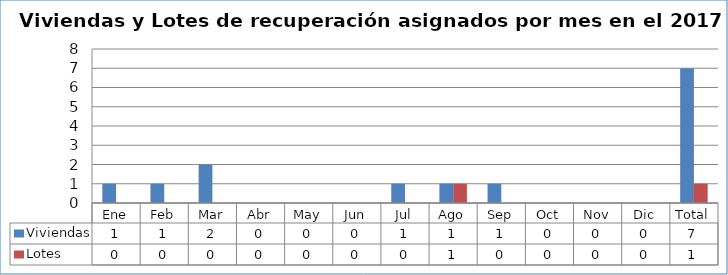
| Category | Viviendas | Lotes |
|---|---|---|
| Ene | 1 | 0 |
| Feb | 1 | 0 |
| Mar | 2 | 0 |
| Abr | 0 | 0 |
| May | 0 | 0 |
| Jun | 0 | 0 |
| Jul | 1 | 0 |
| Ago | 1 | 1 |
| Sep | 1 | 0 |
| Oct | 0 | 0 |
| Nov | 0 | 0 |
| Dic | 0 | 0 |
| Total | 7 | 1 |